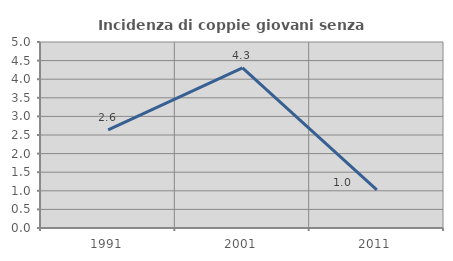
| Category | Incidenza di coppie giovani senza figli |
|---|---|
| 1991.0 | 2.639 |
| 2001.0 | 4.305 |
| 2011.0 | 1.024 |